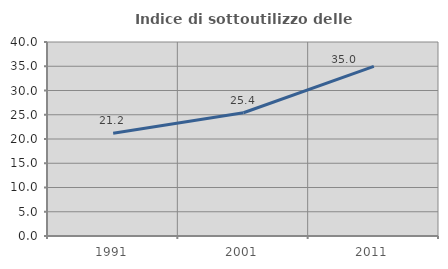
| Category | Indice di sottoutilizzo delle abitazioni  |
|---|---|
| 1991.0 | 21.198 |
| 2001.0 | 25.405 |
| 2011.0 | 34.977 |